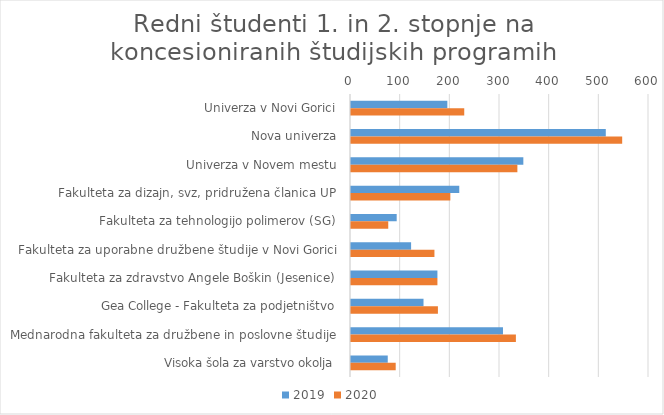
| Category | 2019 | 2020 |
|---|---|---|
| Univerza v Novi Gorici | 194 | 228 |
| Nova univerza | 513 | 546 |
| Univerza v Novem mestu | 347 | 335 |
| Fakulteta za dizajn, svz, pridružena članica UP | 218 | 200 |
| Fakulteta za tehnologijo polimerov (SG) | 92 | 75 |
| Fakulteta za uporabne družbene študije v Novi Gorici | 121 | 168 |
| Fakulteta za zdravstvo Angele Boškin (Jesenice) | 174 | 174 |
| Gea College - Fakulteta za podjetništvo | 146 | 175 |
| Mednarodna fakulteta za družbene in poslovne študije | 306 | 332 |
| Visoka šola za varstvo okolja | 74 | 90 |